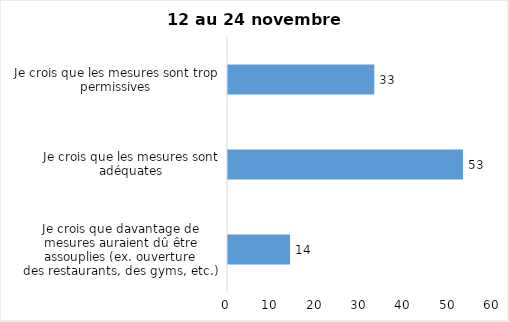
| Category | Series 0 |
|---|---|
| Je crois que davantage de mesures auraient dû être assouplies (ex. ouverture
des restaurants, des gyms, etc.) | 14 |
| Je crois que les mesures sont adéquates | 53 |
| Je crois que les mesures sont trop permissives | 33 |